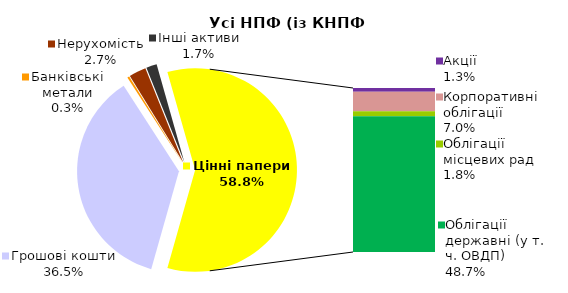
| Category | Усі НПФ (із КНПФ НБУ)* |
|---|---|
| Грошові кошти | 1468.079 |
| Банківські метали | 13.464 |
| Нерухомість | 109.428 |
| Інші активи | 67.773 |
| Акції | 53.713 |
| Корпоративні облігації | 281.426 |
| Облігації місцевих рад | 72.215 |
| Облігації державні (у т. ч. ОВДП) | 1958.646 |